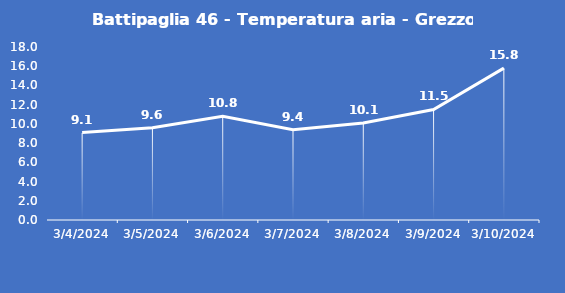
| Category | Battipaglia 46 - Temperatura aria - Grezzo (°C) |
|---|---|
| 3/4/24 | 9.1 |
| 3/5/24 | 9.6 |
| 3/6/24 | 10.8 |
| 3/7/24 | 9.4 |
| 3/8/24 | 10.1 |
| 3/9/24 | 11.5 |
| 3/10/24 | 15.8 |